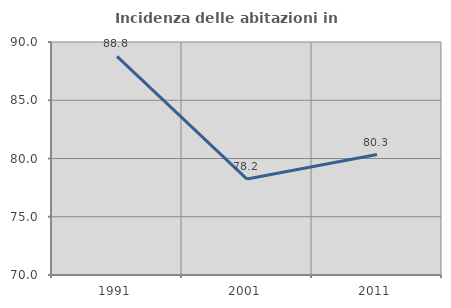
| Category | Incidenza delle abitazioni in proprietà  |
|---|---|
| 1991.0 | 88.763 |
| 2001.0 | 78.232 |
| 2011.0 | 80.34 |